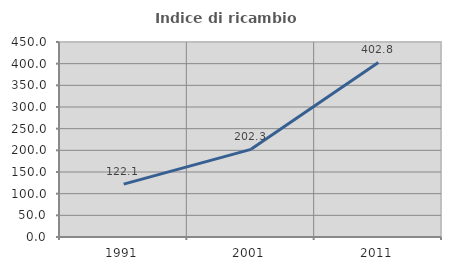
| Category | Indice di ricambio occupazionale  |
|---|---|
| 1991.0 | 122.108 |
| 2001.0 | 202.305 |
| 2011.0 | 402.794 |